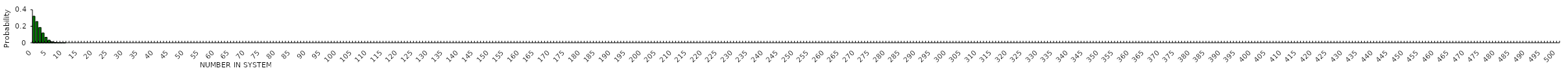
| Category | Series 0 |
|---|---|
| 0.0 | 0.322 |
| 1.0 | 0.258 |
| 2.0 | 0.185 |
| 3.0 | 0.119 |
| 4.0 | 0.066 |
| 5.0 | 0.032 |
| 6.0 | 0.013 |
| 7.0 | 0.004 |
| 8.0 | 0.001 |
| 9.0 | 0 |
| 10.0 | 0 |
| 11.0 | 0 |
| 12.0 | 0 |
| 13.0 | 0 |
| 14.0 | 0 |
| 15.0 | 0 |
| 16.0 | 0 |
| 17.0 | 0 |
| 18.0 | 0 |
| 19.0 | 0 |
| 20.0 | 0 |
| 21.0 | 0 |
| 22.0 | 0 |
| 23.0 | 0 |
| 24.0 | 0 |
| 25.0 | 0 |
| 26.0 | 0 |
| 27.0 | 0 |
| 28.0 | 0 |
| 29.0 | 0 |
| 30.0 | 0 |
| 31.0 | 0 |
| 32.0 | 0 |
| 33.0 | 0 |
| 34.0 | 0 |
| 35.0 | 0 |
| 36.0 | 0 |
| 37.0 | 0 |
| 38.0 | 0 |
| 39.0 | 0 |
| 40.0 | 0 |
| 41.0 | 0 |
| 42.0 | 0 |
| 43.0 | 0 |
| 44.0 | 0 |
| 45.0 | 0 |
| 46.0 | 0 |
| 47.0 | 0 |
| 48.0 | 0 |
| 49.0 | 0 |
| 50.0 | 0 |
| 51.0 | 0 |
| 52.0 | 0 |
| 53.0 | 0 |
| 54.0 | 0 |
| 55.0 | 0 |
| 56.0 | 0 |
| 57.0 | 0 |
| 58.0 | 0 |
| 59.0 | 0 |
| 60.0 | 0 |
| 61.0 | 0 |
| 62.0 | 0 |
| 63.0 | 0 |
| 64.0 | 0 |
| 65.0 | 0 |
| 66.0 | 0 |
| 67.0 | 0 |
| 68.0 | 0 |
| 69.0 | 0 |
| 70.0 | 0 |
| 71.0 | 0 |
| 72.0 | 0 |
| 73.0 | 0 |
| 74.0 | 0 |
| 75.0 | 0 |
| 76.0 | 0 |
| 77.0 | 0 |
| 78.0 | 0 |
| 79.0 | 0 |
| 80.0 | 0 |
| 81.0 | 0 |
| 82.0 | 0 |
| 83.0 | 0 |
| 84.0 | 0 |
| 85.0 | 0 |
| 86.0 | 0 |
| 87.0 | 0 |
| 88.0 | 0 |
| 89.0 | 0 |
| 90.0 | 0 |
| 91.0 | 0 |
| 92.0 | 0 |
| 93.0 | 0 |
| 94.0 | 0 |
| 95.0 | 0 |
| 96.0 | 0 |
| 97.0 | 0 |
| 98.0 | 0 |
| 99.0 | 0 |
| 100.0 | 0 |
| 101.0 | 0 |
| 102.0 | 0 |
| 103.0 | 0 |
| 104.0 | 0 |
| 105.0 | 0 |
| 106.0 | 0 |
| 107.0 | 0 |
| 108.0 | 0 |
| 109.0 | 0 |
| 110.0 | 0 |
| 111.0 | 0 |
| 112.0 | 0 |
| 113.0 | 0 |
| 114.0 | 0 |
| 115.0 | 0 |
| 116.0 | 0 |
| 117.0 | 0 |
| 118.0 | 0 |
| 119.0 | 0 |
| 120.0 | 0 |
| 121.0 | 0 |
| 122.0 | 0 |
| 123.0 | 0 |
| 124.0 | 0 |
| 125.0 | 0 |
| 126.0 | 0 |
| 127.0 | 0 |
| 128.0 | 0 |
| 129.0 | 0 |
| 130.0 | 0 |
| 131.0 | 0 |
| 132.0 | 0 |
| 133.0 | 0 |
| 134.0 | 0 |
| 135.0 | 0 |
| 136.0 | 0 |
| 137.0 | 0 |
| 138.0 | 0 |
| 139.0 | 0 |
| 140.0 | 0 |
| 141.0 | 0 |
| 142.0 | 0 |
| 143.0 | 0 |
| 144.0 | 0 |
| 145.0 | 0 |
| 146.0 | 0 |
| 147.0 | 0 |
| 148.0 | 0 |
| 149.0 | 0 |
| 150.0 | 0 |
| 151.0 | 0 |
| 152.0 | 0 |
| 153.0 | 0 |
| 154.0 | 0 |
| 155.0 | 0 |
| 156.0 | 0 |
| 157.0 | 0 |
| 158.0 | 0 |
| 159.0 | 0 |
| 160.0 | 0 |
| 161.0 | 0 |
| 162.0 | 0 |
| 163.0 | 0 |
| 164.0 | 0 |
| 165.0 | 0 |
| 166.0 | 0 |
| 167.0 | 0 |
| 168.0 | 0 |
| 169.0 | 0 |
| 170.0 | 0 |
| 171.0 | 0 |
| 172.0 | 0 |
| 173.0 | 0 |
| 174.0 | 0 |
| 175.0 | 0 |
| 176.0 | 0 |
| 177.0 | 0 |
| 178.0 | 0 |
| 179.0 | 0 |
| 180.0 | 0 |
| 181.0 | 0 |
| 182.0 | 0 |
| 183.0 | 0 |
| 184.0 | 0 |
| 185.0 | 0 |
| 186.0 | 0 |
| 187.0 | 0 |
| 188.0 | 0 |
| 189.0 | 0 |
| 190.0 | 0 |
| 191.0 | 0 |
| 192.0 | 0 |
| 193.0 | 0 |
| 194.0 | 0 |
| 195.0 | 0 |
| 196.0 | 0 |
| 197.0 | 0 |
| 198.0 | 0 |
| 199.0 | 0 |
| 200.0 | 0 |
| 201.0 | 0 |
| 202.0 | 0 |
| 203.0 | 0 |
| 204.0 | 0 |
| 205.0 | 0 |
| 206.0 | 0 |
| 207.0 | 0 |
| 208.0 | 0 |
| 209.0 | 0 |
| 210.0 | 0 |
| 211.0 | 0 |
| 212.0 | 0 |
| 213.0 | 0 |
| 214.0 | 0 |
| 215.0 | 0 |
| 216.0 | 0 |
| 217.0 | 0 |
| 218.0 | 0 |
| 219.0 | 0 |
| 220.0 | 0 |
| 221.0 | 0 |
| 222.0 | 0 |
| 223.0 | 0 |
| 224.0 | 0 |
| 225.0 | 0 |
| 226.0 | 0 |
| 227.0 | 0 |
| 228.0 | 0 |
| 229.0 | 0 |
| 230.0 | 0 |
| 231.0 | 0 |
| 232.0 | 0 |
| 233.0 | 0 |
| 234.0 | 0 |
| 235.0 | 0 |
| 236.0 | 0 |
| 237.0 | 0 |
| 238.0 | 0 |
| 239.0 | 0 |
| 240.0 | 0 |
| 241.0 | 0 |
| 242.0 | 0 |
| 243.0 | 0 |
| 244.0 | 0 |
| 245.0 | 0 |
| 246.0 | 0 |
| 247.0 | 0 |
| 248.0 | 0 |
| 249.0 | 0 |
| 250.0 | 0 |
| 251.0 | 0 |
| 252.0 | 0 |
| 253.0 | 0 |
| 254.0 | 0 |
| 255.0 | 0 |
| 256.0 | 0 |
| 257.0 | 0 |
| 258.0 | 0 |
| 259.0 | 0 |
| 260.0 | 0 |
| 261.0 | 0 |
| 262.0 | 0 |
| 263.0 | 0 |
| 264.0 | 0 |
| 265.0 | 0 |
| 266.0 | 0 |
| 267.0 | 0 |
| 268.0 | 0 |
| 269.0 | 0 |
| 270.0 | 0 |
| 271.0 | 0 |
| 272.0 | 0 |
| 273.0 | 0 |
| 274.0 | 0 |
| 275.0 | 0 |
| 276.0 | 0 |
| 277.0 | 0 |
| 278.0 | 0 |
| 279.0 | 0 |
| 280.0 | 0 |
| 281.0 | 0 |
| 282.0 | 0 |
| 283.0 | 0 |
| 284.0 | 0 |
| 285.0 | 0 |
| 286.0 | 0 |
| 287.0 | 0 |
| 288.0 | 0 |
| 289.0 | 0 |
| 290.0 | 0 |
| 291.0 | 0 |
| 292.0 | 0 |
| 293.0 | 0 |
| 294.0 | 0 |
| 295.0 | 0 |
| 296.0 | 0 |
| 297.0 | 0 |
| 298.0 | 0 |
| 299.0 | 0 |
| 300.0 | 0 |
| 301.0 | 0 |
| 302.0 | 0 |
| 303.0 | 0 |
| 304.0 | 0 |
| 305.0 | 0 |
| 306.0 | 0 |
| 307.0 | 0 |
| 308.0 | 0 |
| 309.0 | 0 |
| 310.0 | 0 |
| 311.0 | 0 |
| 312.0 | 0 |
| 313.0 | 0 |
| 314.0 | 0 |
| 315.0 | 0 |
| 316.0 | 0 |
| 317.0 | 0 |
| 318.0 | 0 |
| 319.0 | 0 |
| 320.0 | 0 |
| 321.0 | 0 |
| 322.0 | 0 |
| 323.0 | 0 |
| 324.0 | 0 |
| 325.0 | 0 |
| 326.0 | 0 |
| 327.0 | 0 |
| 328.0 | 0 |
| 329.0 | 0 |
| 330.0 | 0 |
| 331.0 | 0 |
| 332.0 | 0 |
| 333.0 | 0 |
| 334.0 | 0 |
| 335.0 | 0 |
| 336.0 | 0 |
| 337.0 | 0 |
| 338.0 | 0 |
| 339.0 | 0 |
| 340.0 | 0 |
| 341.0 | 0 |
| 342.0 | 0 |
| 343.0 | 0 |
| 344.0 | 0 |
| 345.0 | 0 |
| 346.0 | 0 |
| 347.0 | 0 |
| 348.0 | 0 |
| 349.0 | 0 |
| 350.0 | 0 |
| 351.0 | 0 |
| 352.0 | 0 |
| 353.0 | 0 |
| 354.0 | 0 |
| 355.0 | 0 |
| 356.0 | 0 |
| 357.0 | 0 |
| 358.0 | 0 |
| 359.0 | 0 |
| 360.0 | 0 |
| 361.0 | 0 |
| 362.0 | 0 |
| 363.0 | 0 |
| 364.0 | 0 |
| 365.0 | 0 |
| 366.0 | 0 |
| 367.0 | 0 |
| 368.0 | 0 |
| 369.0 | 0 |
| 370.0 | 0 |
| 371.0 | 0 |
| 372.0 | 0 |
| 373.0 | 0 |
| 374.0 | 0 |
| 375.0 | 0 |
| 376.0 | 0 |
| 377.0 | 0 |
| 378.0 | 0 |
| 379.0 | 0 |
| 380.0 | 0 |
| 381.0 | 0 |
| 382.0 | 0 |
| 383.0 | 0 |
| 384.0 | 0 |
| 385.0 | 0 |
| 386.0 | 0 |
| 387.0 | 0 |
| 388.0 | 0 |
| 389.0 | 0 |
| 390.0 | 0 |
| 391.0 | 0 |
| 392.0 | 0 |
| 393.0 | 0 |
| 394.0 | 0 |
| 395.0 | 0 |
| 396.0 | 0 |
| 397.0 | 0 |
| 398.0 | 0 |
| 399.0 | 0 |
| 400.0 | 0 |
| 401.0 | 0 |
| 402.0 | 0 |
| 403.0 | 0 |
| 404.0 | 0 |
| 405.0 | 0 |
| 406.0 | 0 |
| 407.0 | 0 |
| 408.0 | 0 |
| 409.0 | 0 |
| 410.0 | 0 |
| 411.0 | 0 |
| 412.0 | 0 |
| 413.0 | 0 |
| 414.0 | 0 |
| 415.0 | 0 |
| 416.0 | 0 |
| 417.0 | 0 |
| 418.0 | 0 |
| 419.0 | 0 |
| 420.0 | 0 |
| 421.0 | 0 |
| 422.0 | 0 |
| 423.0 | 0 |
| 424.0 | 0 |
| 425.0 | 0 |
| 426.0 | 0 |
| 427.0 | 0 |
| 428.0 | 0 |
| 429.0 | 0 |
| 430.0 | 0 |
| 431.0 | 0 |
| 432.0 | 0 |
| 433.0 | 0 |
| 434.0 | 0 |
| 435.0 | 0 |
| 436.0 | 0 |
| 437.0 | 0 |
| 438.0 | 0 |
| 439.0 | 0 |
| 440.0 | 0 |
| 441.0 | 0 |
| 442.0 | 0 |
| 443.0 | 0 |
| 444.0 | 0 |
| 445.0 | 0 |
| 446.0 | 0 |
| 447.0 | 0 |
| 448.0 | 0 |
| 449.0 | 0 |
| 450.0 | 0 |
| 451.0 | 0 |
| 452.0 | 0 |
| 453.0 | 0 |
| 454.0 | 0 |
| 455.0 | 0 |
| 456.0 | 0 |
| 457.0 | 0 |
| 458.0 | 0 |
| 459.0 | 0 |
| 460.0 | 0 |
| 461.0 | 0 |
| 462.0 | 0 |
| 463.0 | 0 |
| 464.0 | 0 |
| 465.0 | 0 |
| 466.0 | 0 |
| 467.0 | 0 |
| 468.0 | 0 |
| 469.0 | 0 |
| 470.0 | 0 |
| 471.0 | 0 |
| 472.0 | 0 |
| 473.0 | 0 |
| 474.0 | 0 |
| 475.0 | 0 |
| 476.0 | 0 |
| 477.0 | 0 |
| 478.0 | 0 |
| 479.0 | 0 |
| 480.0 | 0 |
| 481.0 | 0 |
| 482.0 | 0 |
| 483.0 | 0 |
| 484.0 | 0 |
| 485.0 | 0 |
| 486.0 | 0 |
| 487.0 | 0 |
| 488.0 | 0 |
| 489.0 | 0 |
| 490.0 | 0 |
| 491.0 | 0 |
| 492.0 | 0 |
| 493.0 | 0 |
| 494.0 | 0 |
| 495.0 | 0 |
| 496.0 | 0 |
| 497.0 | 0 |
| 498.0 | 0 |
| 499.0 | 0 |
| 500.0 | 0 |